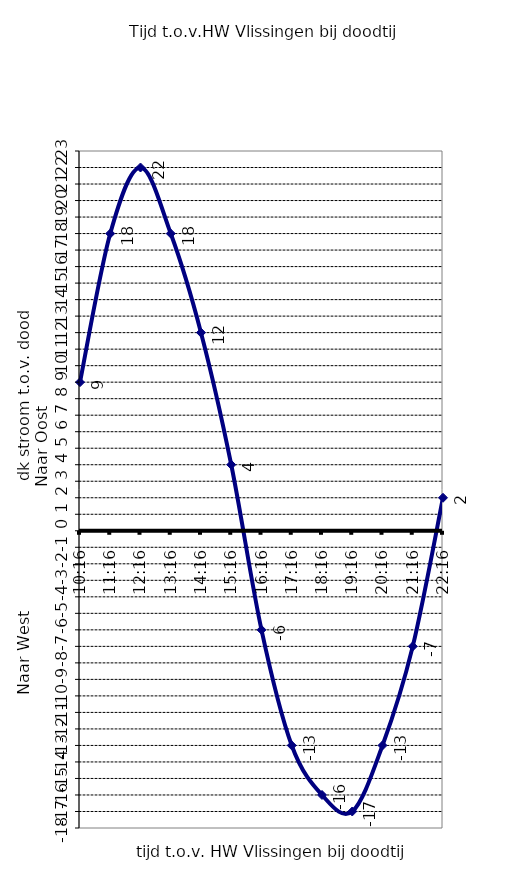
| Category | Series 0 |
|---|---|
| 10:16 | 9 |
| 11:16 | 18 |
| 12:16 | 22 |
| 13:16 | 18 |
| 14:16 | 12 |
| 15:16 | 4 |
| 0.6777777777777778 | -6 |
| 17:16 | -13 |
| 18:16 | -16 |
| 19:16 | -17 |
| 20:16 | -13 |
| 21:16 | -7 |
| 22:16 | 2 |